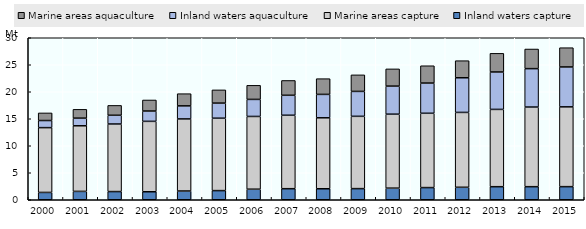
| Category | Inland waters capture | Marine areas capture | Inland waters aquaculture | Marine areas aquaculture |
|---|---|---|---|---|
| 2000.0 | 1.356 | 12 | 1.315 | 1.411 |
| 2001.0 | 1.55 | 12.15 | 1.415 | 1.629 |
| 2002.0 | 1.514 | 12.514 | 1.62 | 1.824 |
| 2003.0 | 1.481 | 13.038 | 1.913 | 2.045 |
| 2004.0 | 1.62 | 13.351 | 2.414 | 2.259 |
| 2005.0 | 1.694 | 13.409 | 2.795 | 2.448 |
| 2006.0 | 1.955 | 13.471 | 3.158 | 2.608 |
| 2007.0 | 2.047 | 13.603 | 3.699 | 2.741 |
| 2008.0 | 2.037 | 13.14 | 4.337 | 2.91 |
| 2009.0 | 2.061 | 13.389 | 4.615 | 3.066 |
| 2010.0 | 2.148 | 13.701 | 5.196 | 3.189 |
| 2011.0 | 2.253 | 13.76 | 5.597 | 3.207 |
| 2012.0 | 2.31 | 13.865 | 6.417 | 3.163 |
| 2013.0 | 2.418 | 14.315 | 6.928 | 3.453 |
| 2014.0 | 2.421 | 14.748 | 7.112 | 3.634 |
| 2015.0 | 2.427 | 14.776 | 7.391 | 3.563 |